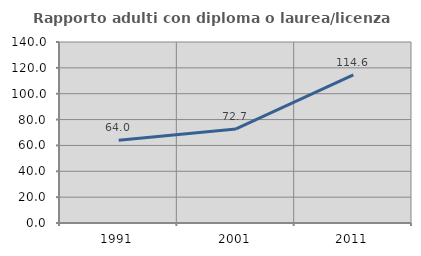
| Category | Rapporto adulti con diploma o laurea/licenza media  |
|---|---|
| 1991.0 | 64.035 |
| 2001.0 | 72.727 |
| 2011.0 | 114.623 |